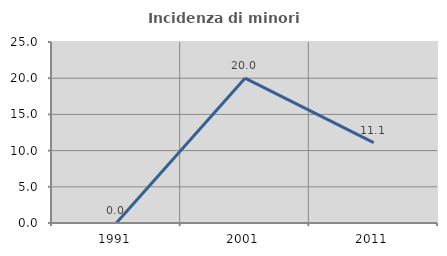
| Category | Incidenza di minori stranieri |
|---|---|
| 1991.0 | 0 |
| 2001.0 | 20 |
| 2011.0 | 11.111 |